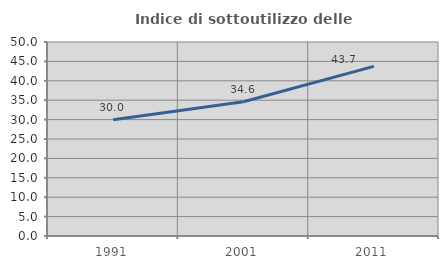
| Category | Indice di sottoutilizzo delle abitazioni  |
|---|---|
| 1991.0 | 29.956 |
| 2001.0 | 34.585 |
| 2011.0 | 43.724 |